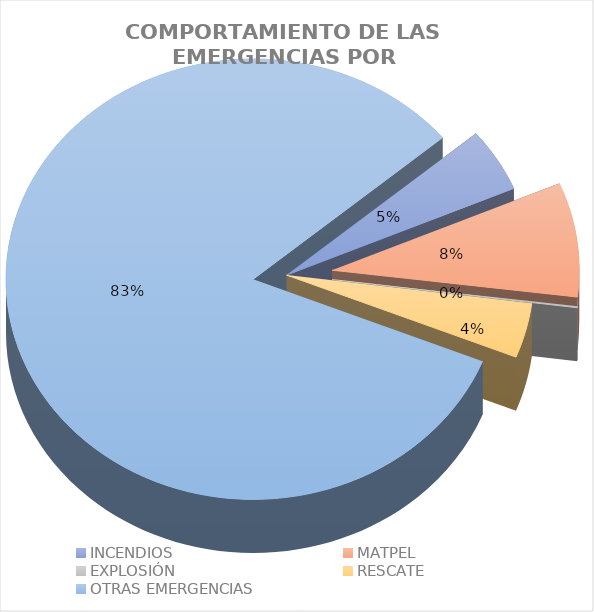
| Category | Series 0 |
|---|---|
| INCENDIOS | 0.047 |
| MATPEL | 0.084 |
| EXPLOSIÓN | 0.001 |
| RESCATE | 0.04 |
| OTRAS EMERGENCIAS | 0.828 |